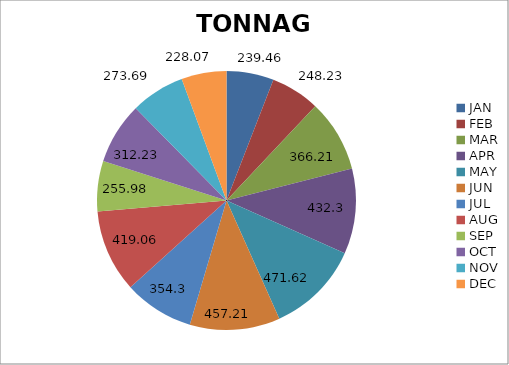
| Category | TONNAGE |
|---|---|
| JAN | 239.46 |
| FEB | 248.23 |
| MAR | 366.21 |
| APR | 432.3 |
| MAY | 471.62 |
| JUN | 457.21 |
| JUL | 354.3 |
| AUG | 419.06 |
| SEP | 255.98 |
| OCT | 312.23 |
| NOV | 273.69 |
| DEC | 228.07 |